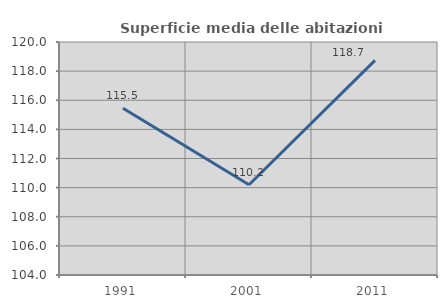
| Category | Superficie media delle abitazioni occupate |
|---|---|
| 1991.0 | 115.451 |
| 2001.0 | 110.198 |
| 2011.0 | 118.739 |